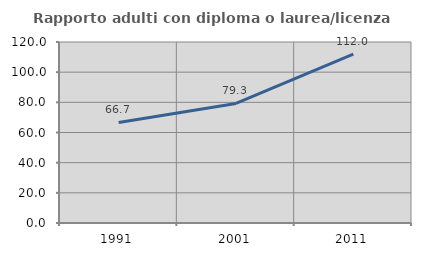
| Category | Rapporto adulti con diploma o laurea/licenza media  |
|---|---|
| 1991.0 | 66.667 |
| 2001.0 | 79.279 |
| 2011.0 | 112 |